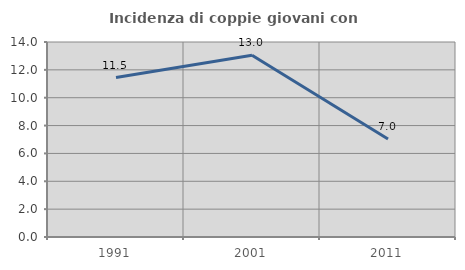
| Category | Incidenza di coppie giovani con figli |
|---|---|
| 1991.0 | 11.45 |
| 2001.0 | 13.043 |
| 2011.0 | 7.031 |